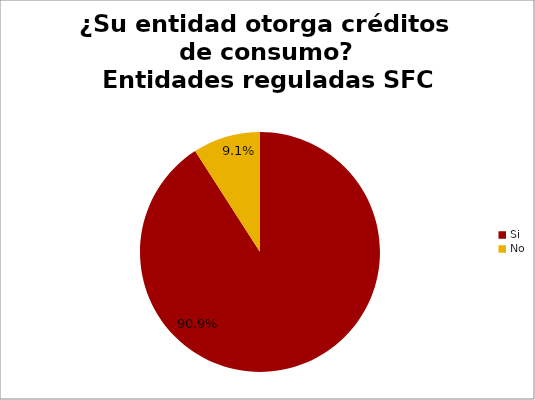
| Category | ¿Su entidad otorga créditos de consumo? Entidades reguladas SFC |
|---|---|
| Si | 0.909 |
| No | 0.091 |